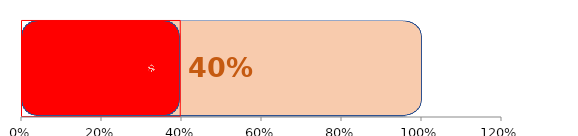
| Category | Series 1 | serie1 |
|---|---|---|
| 0 | 1 | 0.396 |